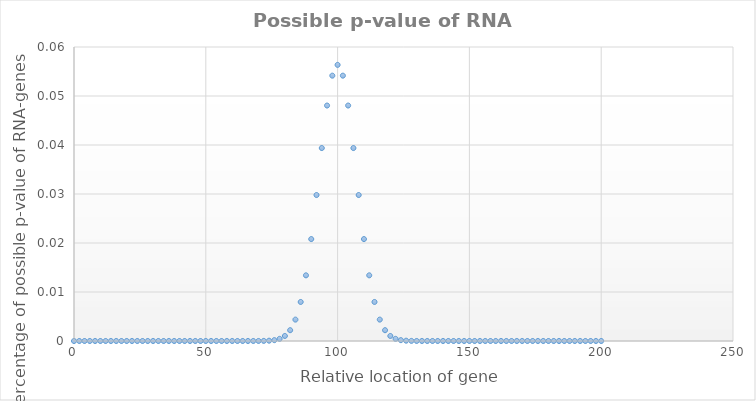
| Category | p-value of RNA |
|---|---|
| 0.0 | 0 |
| 2.0 | 0 |
| 4.0 | 0 |
| 6.0 | 0 |
| 8.0 | 0 |
| 10.0 | 0 |
| 12.0 | 0 |
| 14.0 | 0 |
| 16.0 | 0 |
| 18.0 | 0 |
| 20.0 | 0 |
| 22.0 | 0 |
| 24.0 | 0 |
| 26.0 | 0 |
| 28.0 | 0 |
| 30.0 | 0 |
| 32.0 | 0 |
| 34.0 | 0 |
| 36.0 | 0 |
| 38.0 | 0 |
| 40.0 | 0 |
| 42.0 | 0 |
| 44.0 | 0 |
| 46.0 | 0 |
| 48.0 | 0 |
| 50.0 | 0 |
| 52.0 | 0 |
| 54.0 | 0 |
| 56.0 | 0 |
| 58.0 | 0 |
| 60.0 | 0 |
| 62.0 | 0 |
| 64.0 | 0 |
| 66.0 | 0 |
| 68.0 | 0 |
| 70.0 | 0 |
| 72.0 | 0 |
| 74.0 | 0 |
| 76.0 | 0 |
| 78.0 | 0 |
| 80.0 | 0.001 |
| 82.0 | 0.002 |
| 84.0 | 0.004 |
| 86.0 | 0.008 |
| 88.0 | 0.013 |
| 90.0 | 0.021 |
| 92.0 | 0.03 |
| 94.0 | 0.039 |
| 96.0 | 0.048 |
| 98.0 | 0.054 |
| 100.0 | 0.056 |
| 102.0 | 0.054 |
| 104.0 | 0.048 |
| 106.0 | 0.039 |
| 108.0 | 0.03 |
| 110.0 | 0.021 |
| 112.0 | 0.013 |
| 114.0 | 0.008 |
| 116.0 | 0.004 |
| 118.0 | 0.002 |
| 120.0 | 0.001 |
| 122.0 | 0 |
| 124.0 | 0 |
| 126.0 | 0 |
| 128.0 | 0 |
| 130.0 | 0 |
| 132.0 | 0 |
| 134.0 | 0 |
| 136.0 | 0 |
| 138.0 | 0 |
| 140.0 | 0 |
| 142.0 | 0 |
| 144.0 | 0 |
| 146.0 | 0 |
| 148.0 | 0 |
| 150.0 | 0 |
| 152.0 | 0 |
| 154.0 | 0 |
| 156.0 | 0 |
| 158.0 | 0 |
| 160.0 | 0 |
| 162.0 | 0 |
| 164.0 | 0 |
| 166.0 | 0 |
| 168.0 | 0 |
| 170.0 | 0 |
| 172.0 | 0 |
| 174.0 | 0 |
| 176.0 | 0 |
| 178.0 | 0 |
| 180.0 | 0 |
| 182.0 | 0 |
| 184.0 | 0 |
| 186.0 | 0 |
| 188.0 | 0 |
| 190.0 | 0 |
| 192.0 | 0 |
| 194.0 | 0 |
| 196.0 | 0 |
| 198.0 | 0 |
| 200.0 | 0 |